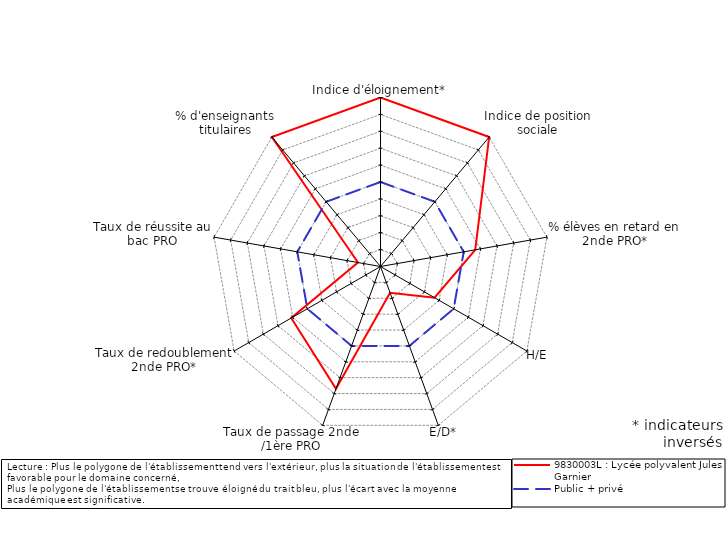
| Category | 9830003L : Lycée polyvalent Jules Garnier | Public + privé |
|---|---|---|
| Indice d'éloignement* | 5 | 0 |
| Indice de position sociale | 5 | 0 |
| % élèves en retard en 2nde PRO* | 0.692 | 0 |
| H/E | -1.308 | 0 |
| E/D* | -3.347 | 0 |
| Taux de passage 2nde /1ère PRO | 2.7 | 0 |
| Taux de redoublement 2nde PRO* | 1.1 | 0 |
| Taux de réussite au bac PRO | -3.646 | 0 |
| % d'enseignants titulaires | 5 | 0 |